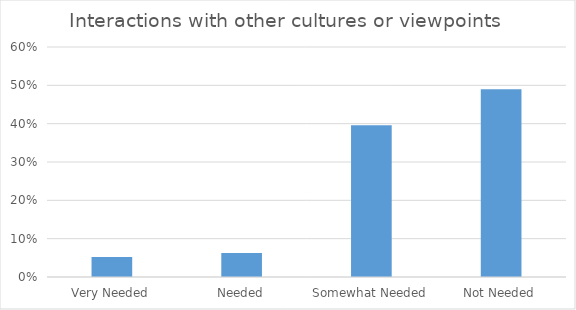
| Category | Interactions with other cultures or viewpoints  |
|---|---|
| Very Needed | 0.052 |
| Needed | 0.062 |
| Somewhat Needed | 0.396 |
| Not Needed | 0.49 |